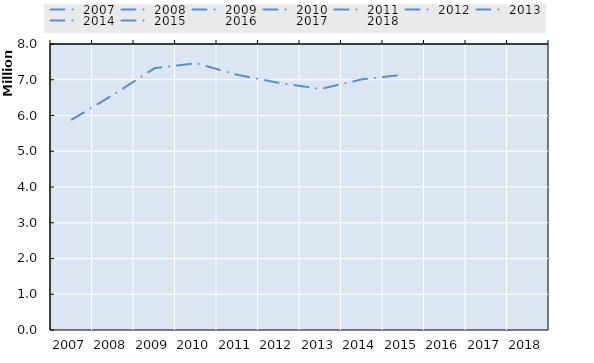
| Category | poor working-age individuals (right) |
|---|---|
| 2007.0 | 5884260 |
| 2008.0 | 6580158 |
| 2009.0 | 7326257.5 |
| 2010.0 | 7461315 |
| 2011.0 | 7135274 |
| 2012.0 | 6911192.5 |
| 2013.0 | 6744195.5 |
| 2014.0 | 7013023.5 |
| 2015.0 | 7142026 |
| 2016.0 | 0 |
| 2017.0 | 0 |
| 2018.0 | 0 |